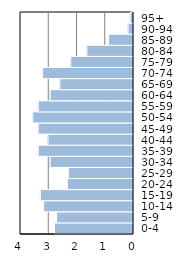
| Category | Series 0 |
|---|---|
| 0-4 | 2.797 |
| 5-9 | 2.72 |
| 10-14 | 3.18 |
| 15-19 | 3.295 |
| 20-24 | 2.337 |
| 25-29 | 2.299 |
| 30-34 | 2.95 |
| 35-39 | 3.372 |
| 40-44 | 3.027 |
| 45-49 | 3.372 |
| 50-54 | 3.563 |
| 55-59 | 3.372 |
| 60-64 | 2.95 |
| 65-69 | 2.605 |
| 70-74 | 3.218 |
| 75-79 | 2.222 |
| 80-84 | 1.648 |
| 85-89 | 0.881 |
| 90-94 | 0.192 |
| 95+ | 0.115 |